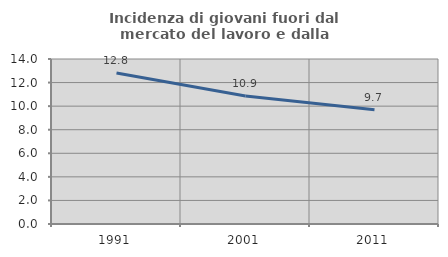
| Category | Incidenza di giovani fuori dal mercato del lavoro e dalla formazione  |
|---|---|
| 1991.0 | 12.821 |
| 2001.0 | 10.857 |
| 2011.0 | 9.694 |